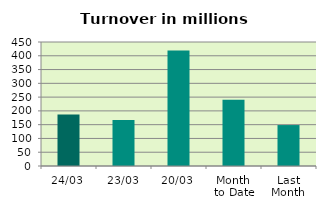
| Category | Series 0 |
|---|---|
| 24/03 | 186.615 |
| 23/03 | 166.711 |
| 20/03 | 419 |
| Month 
to Date | 240.304 |
| Last
Month | 148.578 |